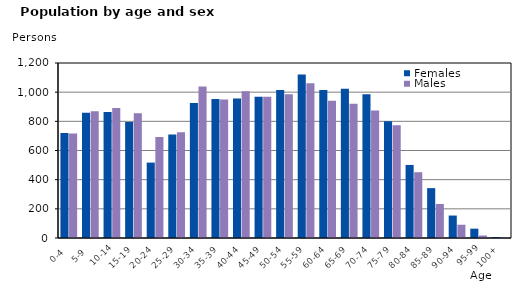
| Category | Females | Males |
|---|---|---|
|   0-4  | 720 | 717 |
|   5-9  | 859 | 869 |
| 10-14 | 864 | 892 |
| 15-19  | 795 | 855 |
| 20-24  | 517 | 692 |
| 25-29  | 709 | 726 |
| 30-34  | 926 | 1039 |
| 35-39  | 953 | 949 |
| 40-44  | 956 | 1006 |
| 45-49  | 968 | 968 |
| 50-54  | 1015 | 985 |
| 55-59  | 1122 | 1061 |
| 60-64  | 1015 | 941 |
| 65-69  | 1023 | 920 |
| 70-74  | 985 | 875 |
| 75-79  | 800 | 774 |
| 80-84  | 501 | 451 |
| 85-89  | 342 | 233 |
| 90-94  | 154 | 91 |
| 95-99 | 64 | 17 |
| 100+ | 7 | 3 |